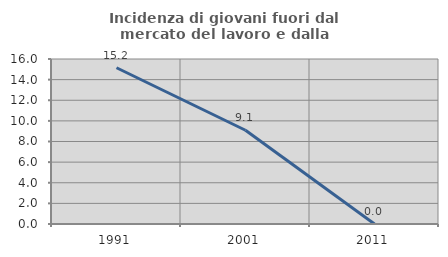
| Category | Incidenza di giovani fuori dal mercato del lavoro e dalla formazione  |
|---|---|
| 1991.0 | 15.152 |
| 2001.0 | 9.091 |
| 2011.0 | 0 |